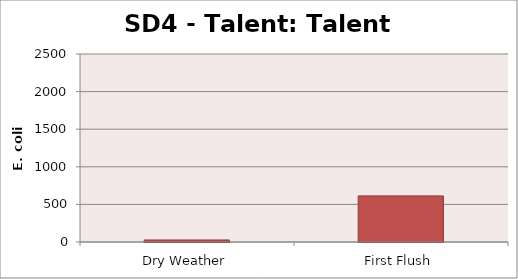
| Category | E. coli MPN |
|---|---|
| Dry Weather | 26.9 |
| First Flush | 613.1 |